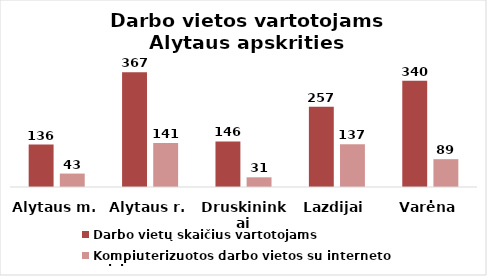
| Category | Darbo vietų skaičius vartotojams | Kompiuterizuotos darbo vietos su interneto prieiga |
|---|---|---|
| Alytaus m. | 136 | 43 |
| Alytaus r. | 367 | 141 |
| Druskininkai | 146 | 31 |
| Lazdijai | 257 | 137 |
| Varėna | 340 | 89 |